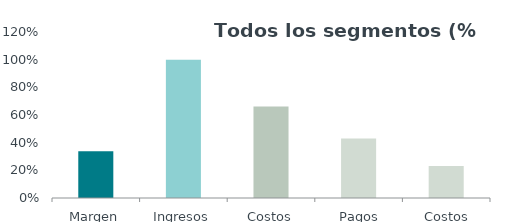
| Category | Series 0 |
|---|---|
| Margen | 0.338 |
| Ingresos | 1 |
| Costos | 0.662 |
| Pagos mayoristas | 0.43 |
| Costos aguas abajo | 0.232 |